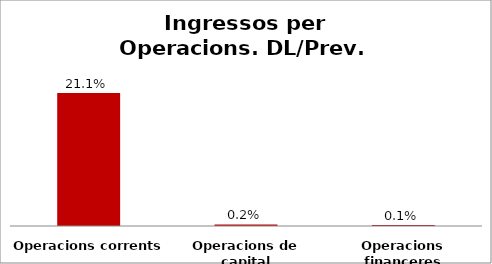
| Category | Series 0 |
|---|---|
| Operacions corrents | 0.211 |
| Operacions de capital | 0.002 |
| Operacions financeres | 0.001 |